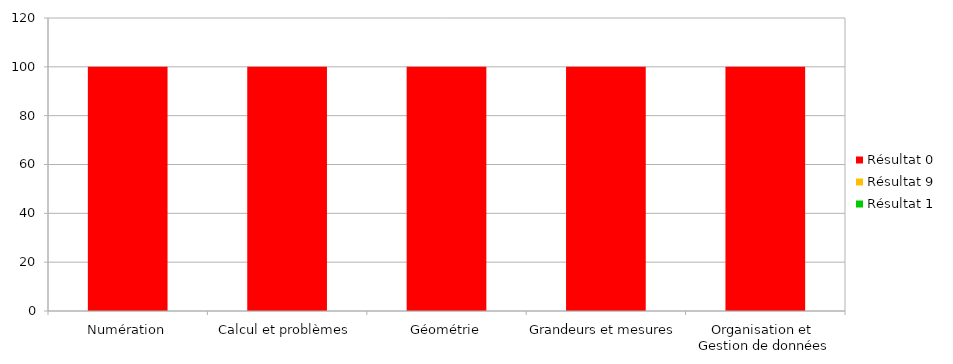
| Category | Résultat 1 | Résultat 9 | Résultat 0 |
|---|---|---|---|
| Numération | 0 | 0 | 100 |
| Calcul et problèmes | 0 | 0 | 100 |
| Géométrie | 0 | 0 | 100 |
| Grandeurs et mesures | 0 | 0 | 100 |
| Organisation et 
Gestion de données | 0 | 0 | 100 |